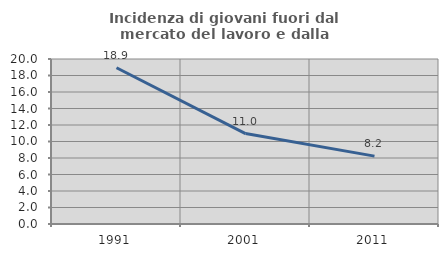
| Category | Incidenza di giovani fuori dal mercato del lavoro e dalla formazione  |
|---|---|
| 1991.0 | 18.943 |
| 2001.0 | 10.959 |
| 2011.0 | 8.229 |